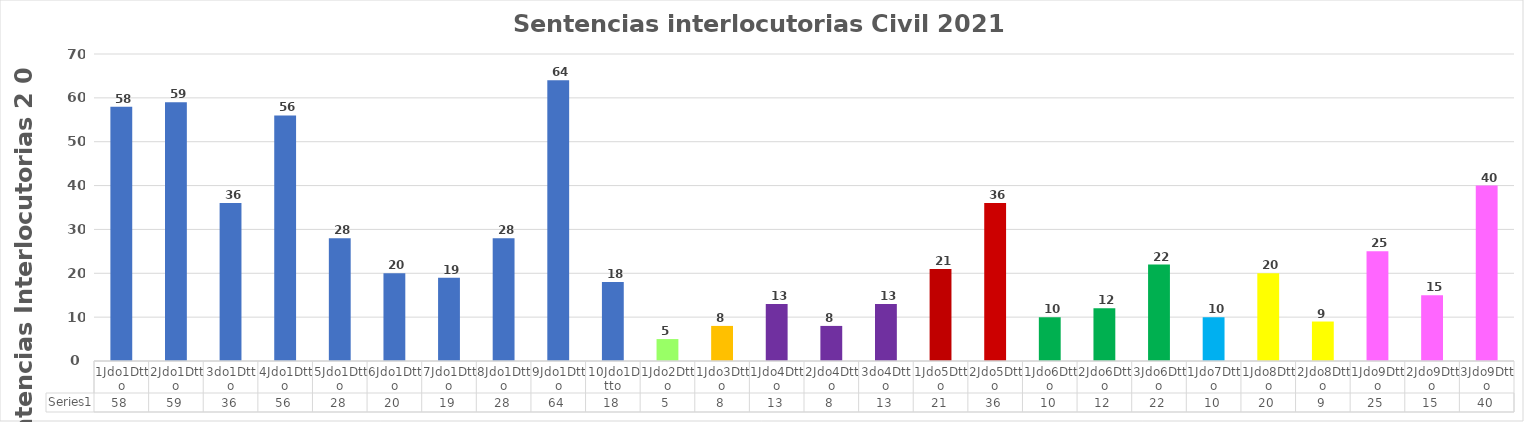
| Category | Series 0 |
|---|---|
| 1Jdo1Dtto | 58 |
| 2Jdo1Dtto | 59 |
| 3do1Dtto | 36 |
| 4Jdo1Dtto | 56 |
| 5Jdo1Dtto | 28 |
| 6Jdo1Dtto | 20 |
| 7Jdo1Dtto | 19 |
| 8Jdo1Dtto | 28 |
| 9Jdo1Dtto | 64 |
| 10Jdo1Dtto | 18 |
| 1Jdo2Dtto | 5 |
| 1Jdo3Dtto | 8 |
| 1Jdo4Dtto | 13 |
| 2Jdo4Dtto | 8 |
| 3do4Dtto | 13 |
| 1Jdo5Dtto | 21 |
| 2Jdo5Dtto | 36 |
| 1Jdo6Dtto | 10 |
| 2Jdo6Dtto | 12 |
| 3Jdo6Dtto | 22 |
| 1Jdo7Dtto | 10 |
| 1Jdo8Dtto | 20 |
| 2Jdo8Dtto | 9 |
| 1Jdo9Dtto | 25 |
| 2Jdo9Dtto | 15 |
| 3Jdo9Dtto | 40 |